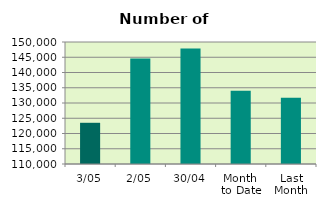
| Category | Series 0 |
|---|---|
| 3/05 | 123512 |
| 2/05 | 144556 |
| 30/04 | 147852 |
| Month 
to Date | 134034 |
| Last
Month | 131708.5 |